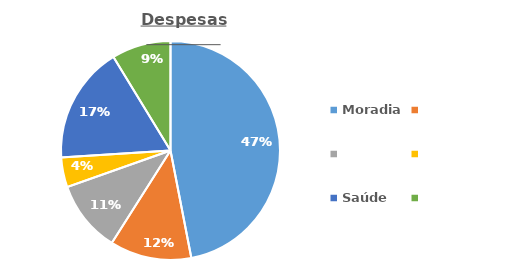
| Category | Despesas Mensais |
|---|---|
| Moradia | 3051.667 |
| Saúde | 783.333 |
| Alimentação | 688.333 |
| Educação | 285 |
| Transporte | 1125 |
| Outros | 566.667 |